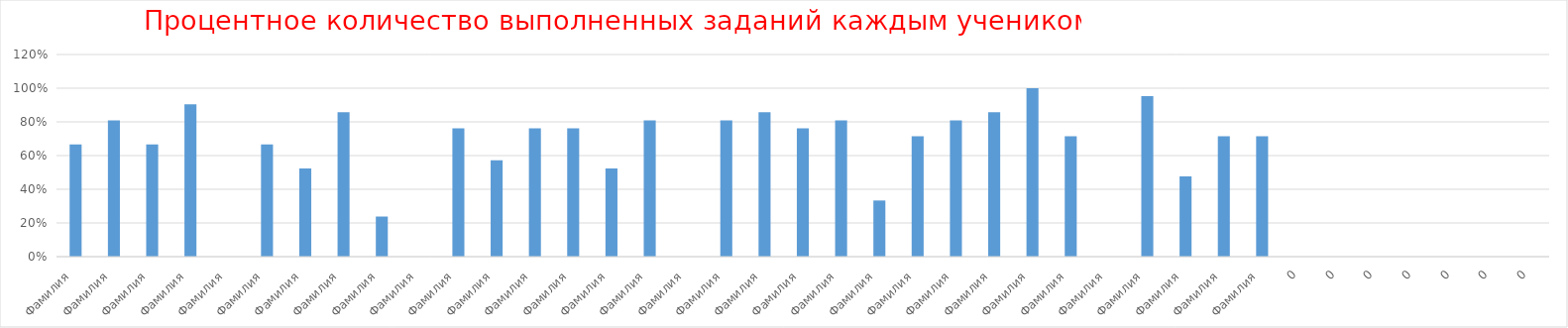
| Category | Series 0 |
|---|---|
| Фамилия  | 0.667 |
| Фамилия  | 0.81 |
| Фамилия  | 0.667 |
| Фамилия  | 0.905 |
| Фамилия  | 0 |
| Фамилия  | 0.667 |
| Фамилия  | 0.524 |
| Фамилия  | 0.857 |
| Фамилия  | 0.238 |
| Фамилия  | 0 |
| Фамилия  | 0.762 |
| Фамилия  | 0.571 |
| Фамилия  | 0.762 |
| Фамилия  | 0.762 |
| Фамилия  | 0.524 |
| Фамилия  | 0.81 |
| Фамилия  | 0 |
| Фамилия  | 0.81 |
| Фамилия  | 0.857 |
| Фамилия  | 0.762 |
| Фамилия  | 0.81 |
| Фамилия  | 0.333 |
| Фамилия  | 0.714 |
| Фамилия  | 0.81 |
| Фамилия  | 0.857 |
| Фамилия  | 1 |
| Фамилия  | 0.714 |
| Фамилия  | 0 |
| Фамилия  | 0.952 |
| Фамилия  | 0.476 |
| Фамилия  | 0.714 |
| Фамилия  | 0.714 |
| 0 | 0 |
| 0 | 0 |
| 0 | 0 |
| 0 | 0 |
| 0 | 0 |
| 0 | 0 |
| 0 | 0 |